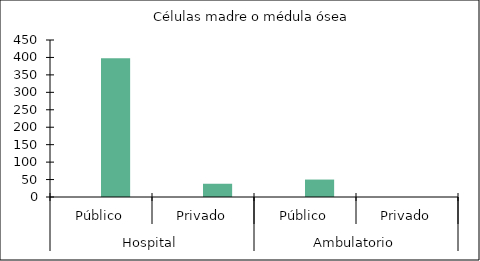
| Category |   |    Células madre o médula ósea |
|---|---|---|
| 0 | 0 | 398 |
| 1 | 0 | 38 |
| 2 | 0 | 50 |
| 3 | 0 | 0 |